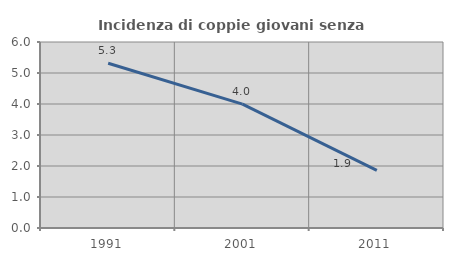
| Category | Incidenza di coppie giovani senza figli |
|---|---|
| 1991.0 | 5.314 |
| 2001.0 | 3.997 |
| 2011.0 | 1.859 |